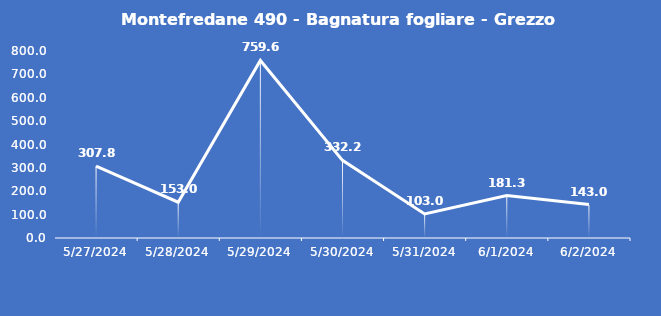
| Category | Montefredane 490 - Bagnatura fogliare - Grezzo (min) |
|---|---|
| 5/27/24 | 307.8 |
| 5/28/24 | 153 |
| 5/29/24 | 759.6 |
| 5/30/24 | 332.2 |
| 5/31/24 | 103 |
| 6/1/24 | 181.3 |
| 6/2/24 | 143 |